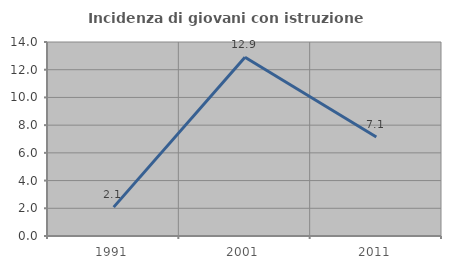
| Category | Incidenza di giovani con istruzione universitaria |
|---|---|
| 1991.0 | 2.083 |
| 2001.0 | 12.903 |
| 2011.0 | 7.143 |